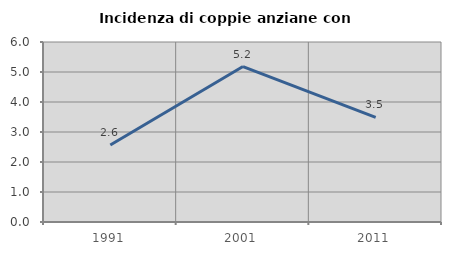
| Category | Incidenza di coppie anziane con figli |
|---|---|
| 1991.0 | 2.564 |
| 2001.0 | 5.181 |
| 2011.0 | 3.488 |